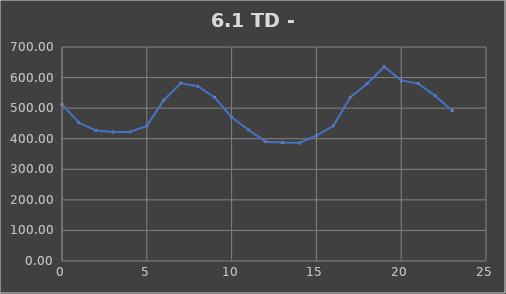
| Category | TOTAL |
|---|---|
| 0.0 | 512.345 |
| 1.0 | 452.095 |
| 2.0 | 427.085 |
| 3.0 | 422.115 |
| 4.0 | 422.115 |
| 5.0 | 442.085 |
| 6.0 | 525.845 |
| 7.0 | 581.535 |
| 8.0 | 571.732 |
| 9.0 | 535.171 |
| 10.0 | 470.231 |
| 11.0 | 428.751 |
| 12.0 | 390.341 |
| 13.0 | 387.371 |
| 14.0 | 385.952 |
| 15.0 | 410.102 |
| 16.0 | 442.062 |
| 17.0 | 535.392 |
| 18.0 | 580.361 |
| 19.0 | 635.631 |
| 20.0 | 590.631 |
| 21.0 | 580.361 |
| 22.0 | 540.732 |
| 23.0 | 492.412 |